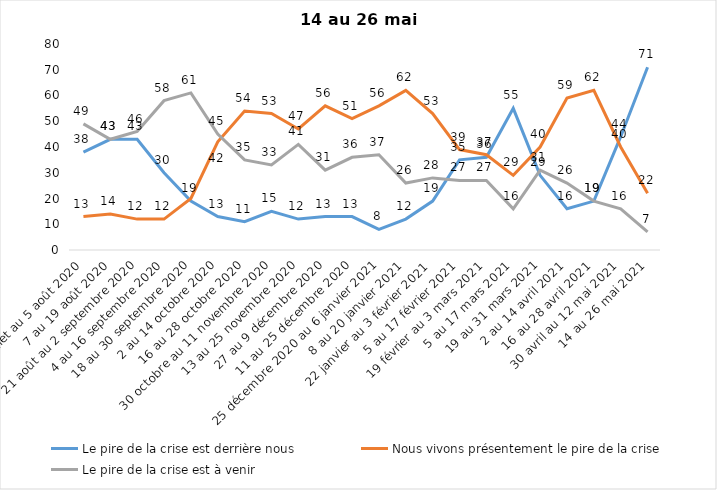
| Category | Le pire de la crise est derrière nous | Nous vivons présentement le pire de la crise | Le pire de la crise est à venir |
|---|---|---|---|
| 24 juillet au 5 août 2020 | 38 | 13 | 49 |
| 7 au 19 août 2020 | 43 | 14 | 43 |
| 21 août au 2 septembre 2020 | 43 | 12 | 46 |
| 4 au 16 septembre 2020 | 30 | 12 | 58 |
| 18 au 30 septembre 2020 | 19 | 20 | 61 |
| 2 au 14 octobre 2020 | 13 | 42 | 45 |
| 16 au 28 octobre 2020 | 11 | 54 | 35 |
| 30 octobre au 11 novembre 2020 | 15 | 53 | 33 |
| 13 au 25 novembre 2020 | 12 | 47 | 41 |
| 27 au 9 décembre 2020 | 13 | 56 | 31 |
| 11 au 25 décembre 2020 | 13 | 51 | 36 |
| 25 décembre 2020 au 6 janvier 2021 | 8 | 56 | 37 |
| 8 au 20 janvier 2021 | 12 | 62 | 26 |
| 22 janvier au 3 février 2021 | 19 | 53 | 28 |
| 5 au 17 février 2021 | 35 | 39 | 27 |
| 19 février au 3 mars 2021 | 36 | 37 | 27 |
| 5 au 17 mars 2021 | 55 | 29 | 16 |
| 19 au 31 mars 2021 | 29 | 40 | 31 |
| 2 au 14 avril 2021 | 16 | 59 | 26 |
| 16 au 28 avril 2021 | 19 | 62 | 19 |
| 30 avril au 12 mai 2021 | 44 | 40 | 16 |
| 14 au 26 mai 2021 | 71 | 22 | 7 |